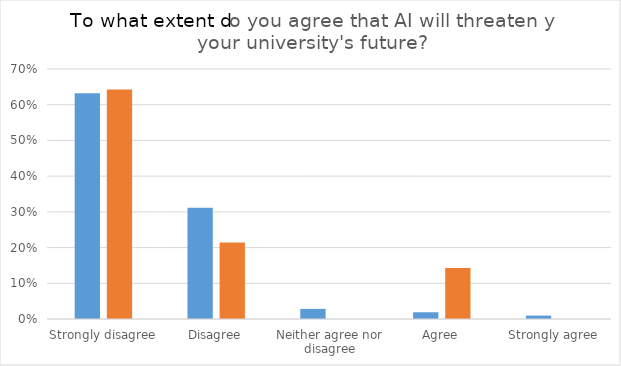
| Category | Series 0 | Leaders |
|---|---|---|
| Strongly disagree | 0.632 | 0.643 |
| Disagree | 0.311 | 0.214 |
| Neither agree nor disagree | 0.028 | 0 |
| Agree | 0.019 | 0.143 |
| Strongly agree | 0.009 | 0 |